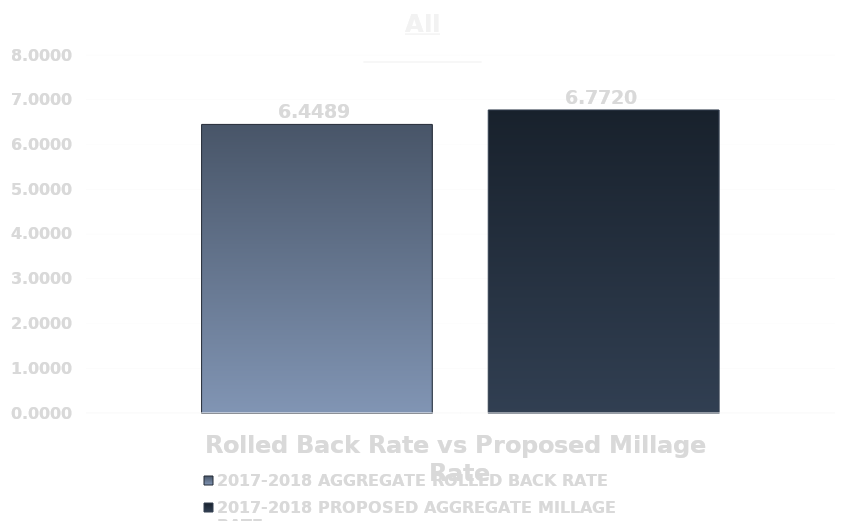
| Category | 2017-2018 AGGREGATE ROLLED BACK RATE | 2017-2018 PROPOSED AGGREGATE MILLAGE RATE |
|---|---|---|
| 0 | 6.449 | 6.772 |